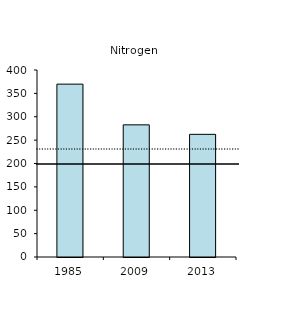
| Category | Series 0 |
|---|---|
| 1985.0 | 369.782 |
| 2009.0 | 282.662 |
| 2013.0 | 262.38 |